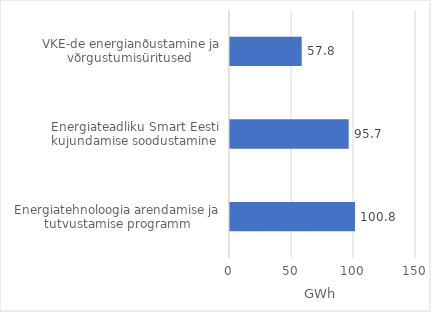
| Category | Series 0 |
|---|---|
| Energiatehnoloogia arendamise ja tutvustamise programm | 100.81 |
| Energiateadliku Smart Eesti kujundamise soodustamine  | 95.719 |
| VKE-de energianõustamine ja võrgustumisüritused  | 57.826 |